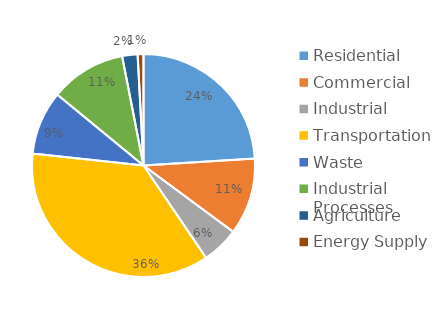
| Category | MTCO2e* |
|---|---|
| Residential | 578291 |
| Commercial | 268245 |
| Industrial | 129998 |
| Transportation | 872298 |
| Waste | 222700 |
| Industrial Processes | 264596 |
| Agriculture | 53721 |
| Energy Supply | 20367 |